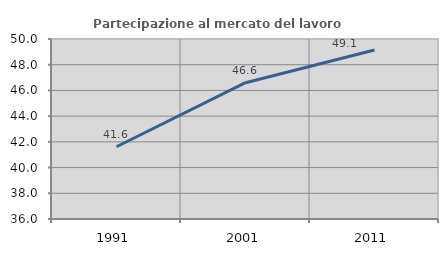
| Category | Partecipazione al mercato del lavoro  femminile |
|---|---|
| 1991.0 | 41.618 |
| 2001.0 | 46.601 |
| 2011.0 | 49.141 |